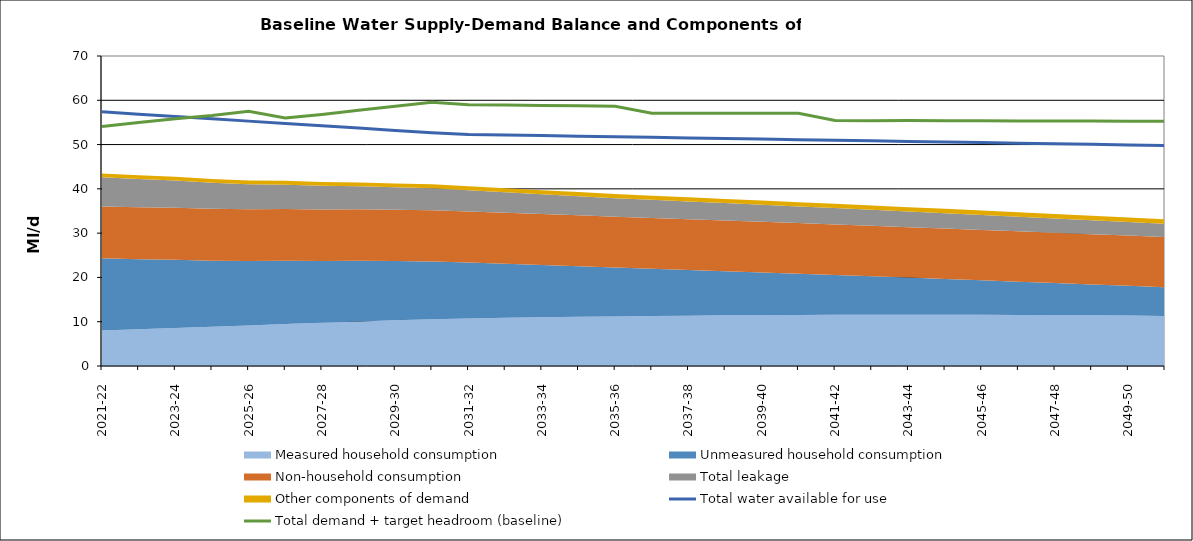
| Category | Total water available for use | Total demand + target headroom (baseline) |
|---|---|---|
| 2020-21 | 57.389 | 54.076 |
| 2021-22 | 56.866 | 54.962 |
| 2022-23 | 56.342 | 55.853 |
| 2023-24 | 55.818 | 56.585 |
| 2024-25 | 55.295 | 57.512 |
| 2025-26 | 54.771 | 56.005 |
| 2026-27 | 54.248 | 56.803 |
| 2027-28 | 53.724 | 57.766 |
| 2028-29 | 53.2 | 58.663 |
| 2029-30 | 52.677 | 59.556 |
| 2030-31 | 52.284 | 58.97 |
| 2031-32 | 52.153 | 58.934 |
| 2032-33 | 52.022 | 58.823 |
| 2033-34 | 51.891 | 58.786 |
| 2034-35 | 51.76 | 58.665 |
| 2035-36 | 51.629 | 57.08 |
| 2036-37 | 51.498 | 57.07 |
| 2037-38 | 51.368 | 57.097 |
| 2038-39 | 51.237 | 57.079 |
| 2039-40 | 51.106 | 57.088 |
| 2040-41 | 50.975 | 55.433 |
| 2041-42 | 50.844 | 55.386 |
| 2042-43 | 50.713 | 55.415 |
| 2043-44 | 50.582 | 55.352 |
| 2044-45 | 50.451 | 55.355 |
| 2045-46 | 50.32 | 55.345 |
| 2046-47 | 50.189 | 55.342 |
| 2047-48 | 50.058 | 55.316 |
| 2048-49 | 49.927 | 55.258 |
| 2049-50 | 49.797 | 55.278 |